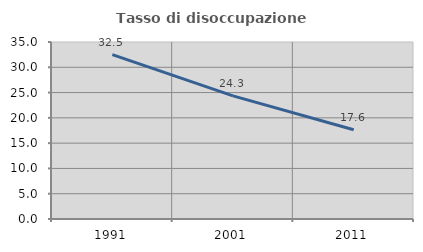
| Category | Tasso di disoccupazione giovanile  |
|---|---|
| 1991.0 | 32.5 |
| 2001.0 | 24.348 |
| 2011.0 | 17.647 |